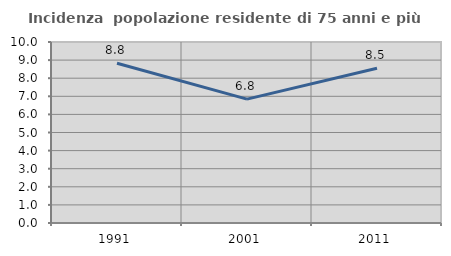
| Category | Incidenza  popolazione residente di 75 anni e più |
|---|---|
| 1991.0 | 8.829 |
| 2001.0 | 6.845 |
| 2011.0 | 8.548 |